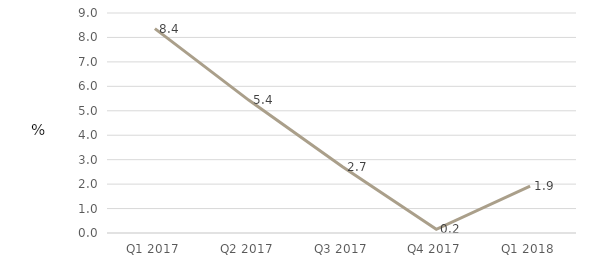
| Category | Households |
|---|---|
| Q1 2017 | 8.36 |
| Q2 2017 | 5.438 |
| Q3 2017 | 2.709 |
| Q4 2017 | 0.15 |
| Q1 2018 | 1.915 |